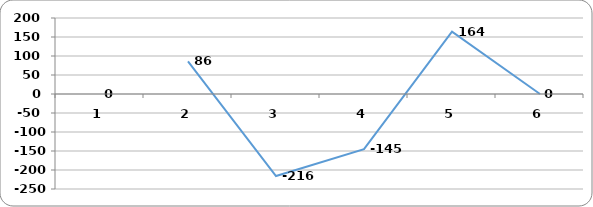
| Category | Series 0 |
|---|---|
| 0 | 0 |
| 1 | 86 |
| 2 | -216 |
| 3 | -145 |
| 4 | 164 |
| 5 | 0 |